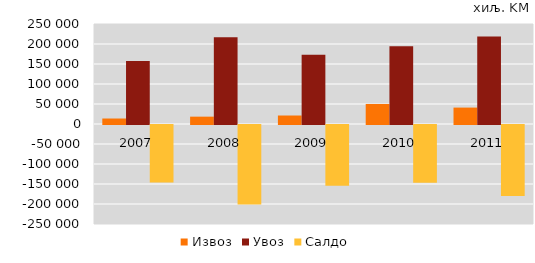
| Category | Извоз | Увоз | Салдо |
|---|---|---|---|
| 2007.0 | 13718 | 157208 | -143490 |
| 2008.0 | 18356 | 216871 | -198515 |
| 2009.0 | 21214 | 173306 | -152092 |
| 2010.0 | 50104 | 194555 | -144451 |
| 2011.0 | 41028 | 218624 | -177596 |